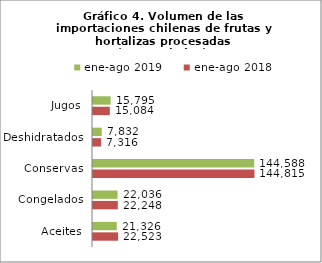
| Category | ene-ago 2018 | ene-ago 2019 |
|---|---|---|
| Aceites | 22522663.915 | 21325893.611 |
| Congelados | 22247820.459 | 22036132.138 |
| Conservas | 144815454.87 | 144587500.247 |
| Deshidratados | 7316427.868 | 7832112.22 |
| Jugos | 15084173.734 | 15795350.002 |